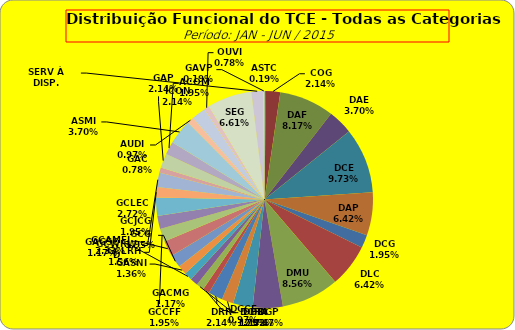
| Category | ASTC COG DAF DAE DCE DAP DCG DLC DMU DGP DIN DPE DRR DGCE DGPA GACMG GAGSC GASNI GCG GCAMFJ GCCFF GCJCG GCLEC GCLRH GCWRWD GAC GAP ACOM ASMI AUDI ICON OUVI SEG SERV À DISP. GAVP |
|---|---|
| ASTC | 1 |
| COG | 11 |
| DAF | 42 |
| DAE | 19 |
| DCE | 50 |
| DAP | 33 |
| DCG | 10 |
| DLC | 33 |
| DMU | 44 |
| DGP | 23 |
| DIN | 15 |
| DPE | 9 |
| DRR | 11 |
| DGCE | 5 |
| DGPA | 6 |
| GACMG | 6 |
| GAGSC | 6 |
| GASNI | 7 |
| GCG | 10 |
| GCAMFJ | 12 |
| GCCFF | 10 |
| GCJCG | 10 |
| GCLEC | 14 |
| GCLRH | 8 |
| GCWRWD | 11 |
| GAC | 4 |
| GAP | 11 |
| ACOM | 10 |
| ASMI | 19 |
| AUDI | 5 |
| ICON | 11 |
| OUVI | 4 |
| SEG | 34 |
| SERV À DISP. | 9 |
| GAVP | 1 |